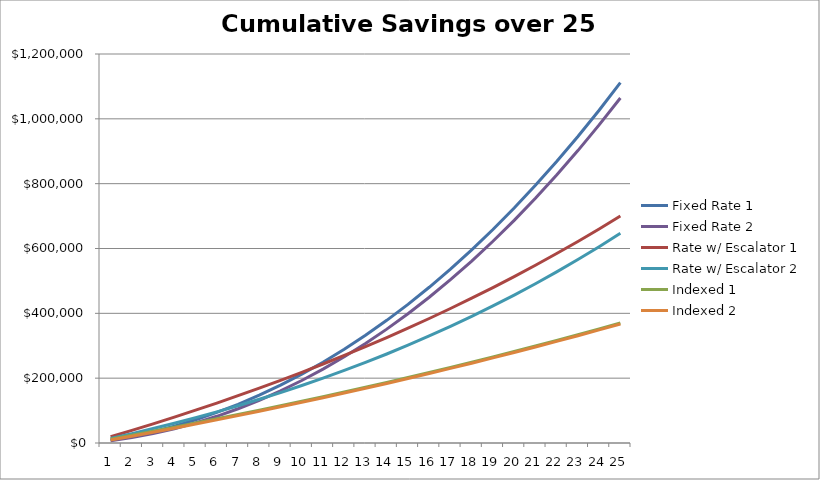
| Category | Fixed Rate 1 | Fixed Rate 2 | Rate w/ Escalator 1 | Rate w/ Escalator 2 | Indexed 1 | Indexed 2 |
|---|---|---|---|---|---|---|
| 0 | 9140 | 7140 | 19140 | 14140 | 11914 | 9140 |
| 1 | 20848.374 | 16858.374 | 38808.374 | 28995.061 | 24029.837 | 20848.374 |
| 2 | 35168.136 | 29198.086 | 59028.685 | 44594.771 | 36352.089 | 33170.625 |
| 3 | 52143.28 | 44203.08 | 79825.131 | 60969.481 | 48885.427 | 45703.963 |
| 4 | 71818.796 | 61918.297 | 101222.558 | 78150.322 | 61634.623 | 58453.159 |
| 5 | 94240.697 | 82389.701 | 123246.48 | 96169.229 | 74604.549 | 71423.086 |
| 6 | 119456.037 | 105664.295 | 145923.09 | 115058.956 | 87800.181 | 84618.717 |
| 7 | 147512.932 | 131790.149 | 169279.283 | 134853.094 | 101226.597 | 98045.134 |
| 8 | 178460.585 | 160816.417 | 193342.67 | 155586.095 | 114888.986 | 111707.523 |
| 9 | 212349.31 | 192793.362 | 218141.595 | 177293.29 | 128792.644 | 125611.18 |
| 10 | 249230.549 | 227772.381 | 243705.154 | 200010.91 | 142942.979 | 139761.516 |
| 11 | 289156.904 | 265806.027 | 270063.216 | 223776.106 | 157345.515 | 154164.052 |
| 12 | 332182.155 | 306948.033 | 297246.436 | 248626.976 | 172005.891 | 168824.428 |
| 13 | 378361.291 | 351253.338 | 325286.282 | 274602.578 | 186929.866 | 183748.403 |
| 14 | 427750.527 | 398778.115 | 354215.047 | 301742.963 | 202123.321 | 198941.858 |
| 15 | 480407.341 | 449579.79 | 384065.877 | 330089.19 | 217592.261 | 214410.798 |
| 16 | 536390.489 | 503717.077 | 414872.783 | 359683.355 | 233342.819 | 230161.355 |
| 17 | 595760.042 | 561249.997 | 446670.672 | 390568.612 | 249381.255 | 246199.792 |
| 18 | 658577.408 | 622239.913 | 479495.362 | 422789.2 | 265713.965 | 262532.502 |
| 19 | 724905.362 | 686749.554 | 513383.604 | 456390.467 | 282347.48 | 279166.016 |
| 20 | 794808.074 | 754843.045 | 548373.111 | 491418.898 | 299288.466 | 296107.003 |
| 21 | 868351.141 | 826585.937 | 584502.573 | 527922.138 | 316543.734 | 313362.271 |
| 22 | 945601.614 | 902045.237 | 621811.687 | 565949.023 | 334120.239 | 330938.775 |
| 23 | 1026628.032 | 981289.437 | 660341.18 | 605549.605 | 352025.08 | 348843.617 |
| 24 | 1111500.451 | 1064388.548 | 700132.831 | 646775.181 | 370265.511 | 367084.047 |